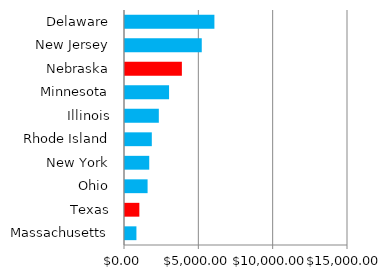
| Category | Series 0 |
|---|---|
| Massachusetts | 768.775 |
| Texas | 965.379 |
| Ohio | 1519.342 |
| New York | 1630.374 |
| Rhode Island | 1803.44 |
| Illinois | 2275.312 |
| Minnesota | 2963.717 |
| Nebraska | 3825.88 |
| New Jersey | 5162.962 |
| Delaware | 6013.79 |